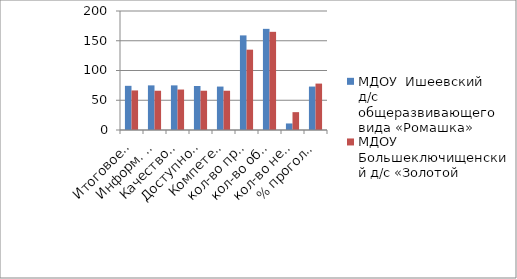
| Category | МДОУ  Ишеевский д/с общеразвивающего вида «Ромашка» | МДОУ Большеключищенский д/с «Золотой ключик» |
|---|---|---|
| Итоговое значение  (по 4 показателям) | 74.25 | 66.5 |
| Информ. откр. | 75 | 66 |
| Качество обр. | 75 | 68 |
| Доступность условий | 74 | 66 |
| Компетен. педагогов | 73 | 66 |
| кол-во проголосовавших | 159 | 135 |
| кол-во обучающихся | 170 | 165 |
| кол-во непроголосовавших | 11 | 30 |
| % проголосовавших | 73 | 78 |